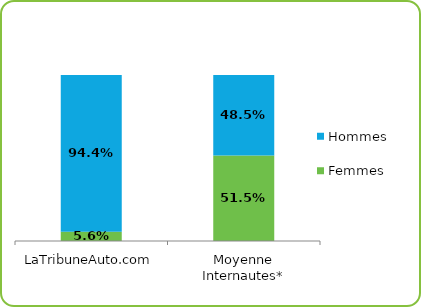
| Category | Femmes | Hommes |
|---|---|---|
| LaTribuneAuto.com | 0.056 | 0.944 |
| Moyenne Internautes* | 0.515 | 0.485 |